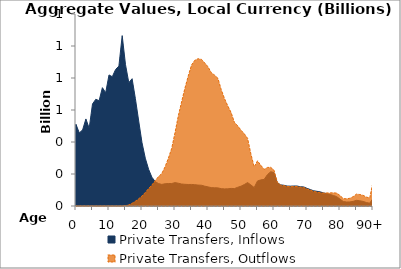
| Category | Private Transfers, Inflows | Private Transfers, Outflows |
|---|---|---|
| 0 | 509.711 | 0 |
|  | 456.838 | 0 |
| 2 | 475.481 | 0 |
| 3 | 544.07 | 0 |
| 4 | 486.021 | 0 |
| 5 | 637.599 | 0 |
| 6 | 667.164 | 0 |
| 7 | 658.056 | 0 |
| 8 | 739.528 | 0 |
| 9 | 708.069 | 0 |
| 10 | 819.198 | 0 |
| 11 | 808.001 | 0 |
| 12 | 853.349 | 0 |
| 13 | 874.664 | 0 |
| 14 | 1064.893 | 0 |
| 15 | 883.2 | 2.483 |
| 16 | 771.057 | 6.686 |
| 17 | 795.602 | 16.794 |
| 18 | 670.665 | 29.837 |
| 19 | 531.155 | 44.876 |
| 20 | 395.248 | 62.512 |
| 21 | 298.731 | 84.459 |
| 22 | 229.37 | 108.937 |
| 23 | 179.867 | 130.743 |
| 24 | 152.511 | 158.478 |
| 25 | 140.086 | 183.629 |
| 26 | 134.944 | 202.994 |
| 27 | 139.12 | 245.25 |
| 28 | 140.575 | 298.922 |
| 29 | 140.457 | 360.328 |
| 30 | 146.146 | 457.616 |
| 31 | 142.331 | 562.828 |
| 32 | 137.46 | 650.659 |
| 33 | 135.61 | 735.638 |
| 34 | 134.448 | 811.515 |
| 35 | 134.681 | 880.54 |
| 36 | 133.182 | 910.883 |
| 37 | 130.804 | 920.424 |
| 38 | 129.746 | 916.818 |
| 39 | 124.072 | 894.728 |
| 40 | 119.396 | 869.898 |
| 41 | 115.011 | 833.365 |
| 42 | 113.918 | 817.876 |
| 43 | 113.194 | 798.146 |
| 44 | 108.402 | 728.099 |
| 45 | 106.88 | 671.335 |
| 46 | 107.393 | 625.421 |
| 47 | 109.896 | 584.266 |
| 48 | 108.816 | 522.989 |
| 49 | 116.924 | 501.61 |
| 50 | 123.77 | 473.855 |
| 51 | 134.188 | 451.22 |
| 52 | 146.46 | 422.854 |
| 53 | 131.548 | 325.382 |
| 54 | 115.318 | 243.947 |
| 55 | 156.415 | 282.28 |
| 56 | 163.194 | 254.671 |
| 57 | 166.002 | 228.936 |
| 58 | 195.569 | 240.856 |
| 59 | 214.351 | 241.721 |
| 60 | 209.289 | 223.975 |
| 61 | 145.833 | 149.299 |
| 62 | 131.961 | 130.619 |
| 63 | 129.577 | 127.068 |
| 64 | 124.538 | 122.445 |
| 65 | 123.98 | 120.998 |
| 66 | 125.081 | 121.494 |
| 67 | 124.95 | 121.924 |
| 68 | 120.083 | 117.021 |
| 69 | 119.238 | 115.976 |
| 70 | 110.405 | 105.942 |
| 71 | 102.856 | 99.025 |
| 72 | 95.053 | 91.039 |
| 73 | 91.733 | 87.039 |
| 74 | 88.348 | 83.201 |
| 75 | 81.796 | 80.511 |
| 76 | 77.418 | 81.575 |
| 77 | 72.038 | 81.91 |
| 78 | 65.712 | 82.279 |
| 79 | 58.625 | 80.693 |
| 80 | 43.084 | 65.527 |
| 81 | 27.864 | 46.213 |
| 82 | 25.001 | 45.096 |
| 83 | 25.405 | 48.342 |
| 84 | 29.055 | 58.561 |
| 85 | 35.489 | 74.317 |
| 86 | 32.657 | 71.765 |
| 87 | 28.598 | 66.859 |
| 88 | 21.76 | 55.822 |
| 89 | 17.473 | 49.858 |
| 90+ | 46.863 | 148.91 |